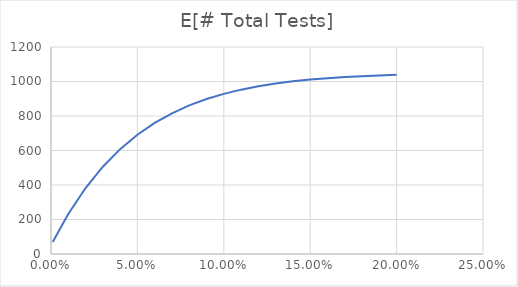
| Category | E[# Total Tests] |
|---|---|
| 0.001 | 69.811 |
| 0.01 | 232.093 |
| 0.02 | 382.392 |
| 0.03 | 506.206 |
| 0.04 | 607.998 |
| 0.05 | 691.514 |
| 0.06 | 759.894 |
| 0.07 | 815.761 |
| 0.08 | 861.307 |
| 0.09 | 898.355 |
| 0.1 | 928.423 |
| 0.11 | 952.77 |
| 0.12 | 972.437 |
| 0.13 | 988.286 |
| 0.14 | 1001.026 |
| 0.15 | 1011.24 |
| 0.16 | 1019.41 |
| 0.17 | 1025.925 |
| 0.18 | 1031.108 |
| 0.19 | 1035.219 |
| 0.2 | 1038.471 |